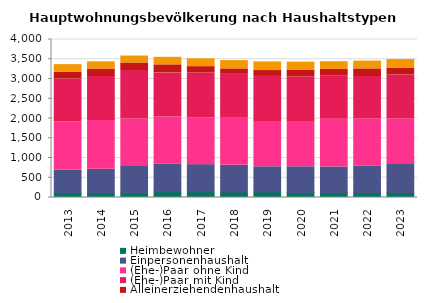
| Category | Heimbewohner | Einpersonenhaushalt | (Ehe-)Paar ohne Kind | (Ehe-)Paar mit Kind | Alleinerziehendenhaushalt | sonstiger Mehrpersonenhaushalt |
|---|---|---|---|---|---|---|
| 2013.0 | 101 | 587 | 1232 | 1082 | 170 | 191 |
| 2014.0 | 101 | 614 | 1232 | 1115 | 191 | 182 |
| 2015.0 | 107 | 698 | 1184 | 1226 | 191 | 176 |
| 2016.0 | 146 | 698 | 1196 | 1115 | 203 | 191 |
| 2017.0 | 143 | 689 | 1178 | 1142 | 161 | 197 |
| 2018.0 | 137 | 677 | 1190 | 1115 | 137 | 209 |
| 2019.0 | 140 | 638 | 1148 | 1139 | 149 | 218 |
| 2020.0 | 128 | 650 | 1145 | 1127 | 176 | 200 |
| 2021.0 | 125 | 647 | 1208 | 1091 | 173 | 194 |
| 2022.0 | 125 | 668 | 1202 | 1067 | 194 | 197 |
| 2023.0 | 128 | 707 | 1160 | 1103 | 179 | 215 |